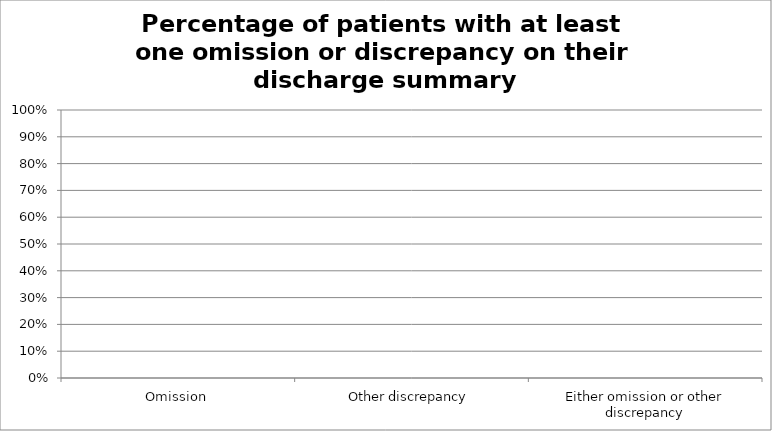
| Category | Percentage of patients with at least one omission or discrepancy at discharge |
|---|---|
| Omission | 0 |
| Other discrepancy | 0 |
| Either omission or other discrepancy | 0 |